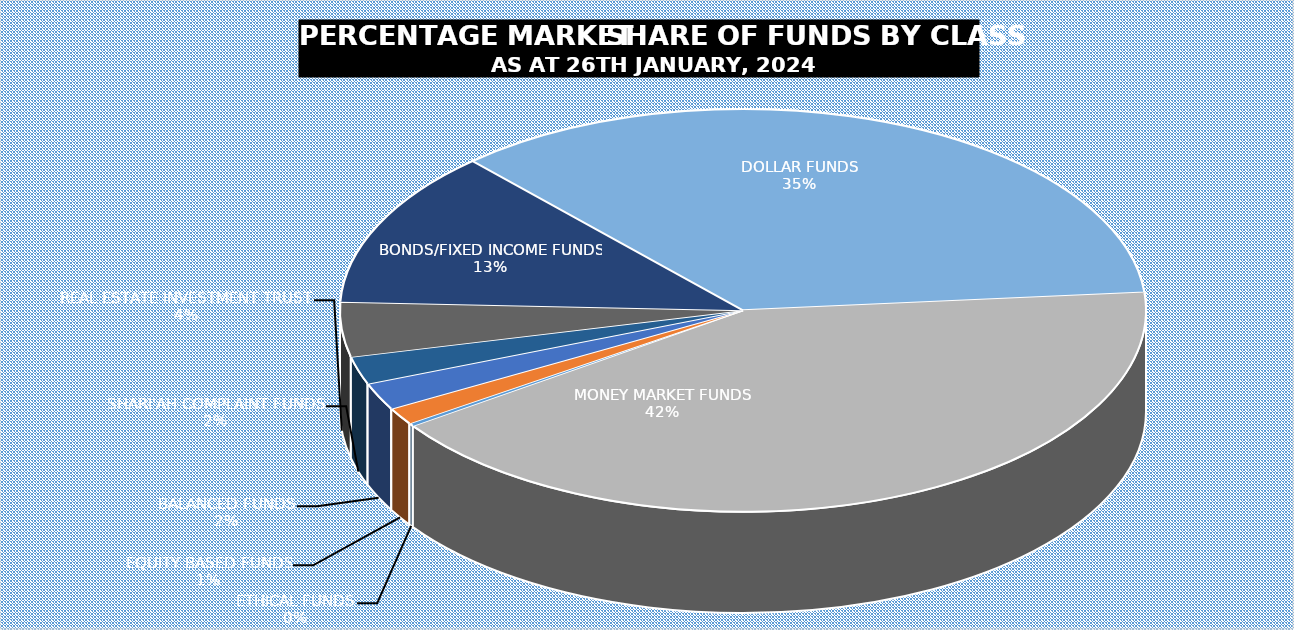
| Category | 26-Jan |
|---|---|
| ETHICAL FUNDS | 5351667060.35 |
| EQUITY BASED FUNDS | 31149538694.629 |
| BALANCED FUNDS | 49842890629.951 |
| SHARI'AH COMPLAINT FUNDS | 50649516378.67 |
| REAL ESTATE INVESTMENT TRUST | 100204717801.015 |
| BONDS/FIXED INCOME FUNDS | 287140620370.692 |
| DOLLAR FUNDS | 804116651844.989 |
| MONEY MARKET FUNDS | 949716593900.38 |